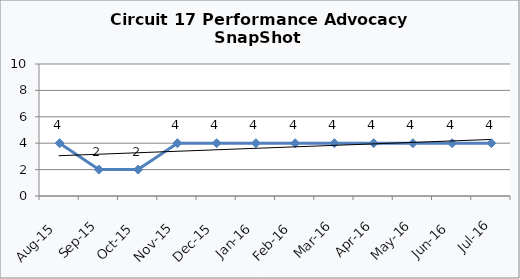
| Category | Circuit 17 |
|---|---|
| Aug-15 | 4 |
| Sep-15 | 2 |
| Oct-15 | 2 |
| Nov-15 | 4 |
| Dec-15 | 4 |
| Jan-16 | 4 |
| Feb-16 | 4 |
| Mar-16 | 4 |
| Apr-16 | 4 |
| May-16 | 4 |
| Jun-16 | 4 |
| Jul-16 | 4 |